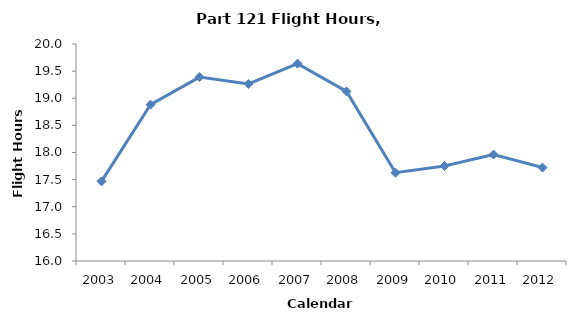
| Category | Flight Hours (millions) |
|---|---|
| 2003.0 | 17.468 |
| 2004.0 | 18.883 |
| 2005.0 | 19.39 |
| 2006.0 | 19.263 |
| 2007.0 | 19.637 |
| 2008.0 | 19.127 |
| 2009.0 | 17.627 |
| 2010.0 | 17.751 |
| 2011.0 | 17.963 |
| 2012.0 | 17.722 |